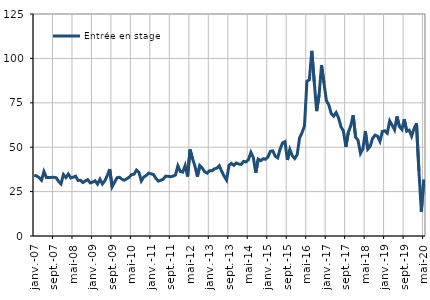
| Category | Entrée en stage |
|---|---|
| 2007-01-01 | 34.2 |
| 2007-02-01 | 33.8 |
| 2007-03-01 | 32.9 |
| 2007-04-01 | 31.4 |
| 2007-05-01 | 36.3 |
| 2007-06-01 | 33 |
| 2007-07-01 | 33 |
| 2007-08-01 | 33 |
| 2007-09-01 | 33.1 |
| 2007-10-01 | 32.8 |
| 2007-11-01 | 30.8 |
| 2007-12-01 | 29.3 |
| 2008-01-01 | 34.6 |
| 2008-02-01 | 32.9 |
| 2008-03-01 | 34.9 |
| 2008-04-01 | 32.7 |
| 2008-05-01 | 33.1 |
| 2008-06-01 | 33.7 |
| 2008-07-01 | 31.3 |
| 2008-08-01 | 31.4 |
| 2008-09-01 | 30.1 |
| 2008-10-01 | 31 |
| 2008-11-01 | 31.7 |
| 2008-12-01 | 29.9 |
| 2009-01-01 | 30.3 |
| 2009-02-01 | 31.1 |
| 2009-03-01 | 29.2 |
| 2009-04-01 | 32 |
| 2009-05-01 | 29.3 |
| 2009-06-01 | 31.1 |
| 2009-07-01 | 34 |
| 2009-08-01 | 37.7 |
| 2009-09-01 | 27.7 |
| 2009-10-01 | 30.3 |
| 2009-11-01 | 32.8 |
| 2009-12-01 | 33.1 |
| 2010-01-01 | 32 |
| 2010-02-01 | 31.4 |
| 2010-03-01 | 32.2 |
| 2010-04-01 | 33.1 |
| 2010-05-01 | 34.5 |
| 2010-06-01 | 34.8 |
| 2010-07-01 | 37.1 |
| 2010-08-01 | 35.9 |
| 2010-09-01 | 31 |
| 2010-10-01 | 33.2 |
| 2010-11-01 | 34.1 |
| 2010-12-01 | 35.4 |
| 2011-01-01 | 35 |
| 2011-02-01 | 34.6 |
| 2011-03-01 | 32.4 |
| 2011-04-01 | 30.9 |
| 2011-05-01 | 31.4 |
| 2011-06-01 | 32 |
| 2011-07-01 | 33.7 |
| 2011-08-01 | 33.6 |
| 2011-09-01 | 33.4 |
| 2011-10-01 | 33.7 |
| 2011-11-01 | 34.3 |
| 2011-12-01 | 39.5 |
| 2012-01-01 | 36.3 |
| 2012-02-01 | 36 |
| 2012-03-01 | 39.7 |
| 2012-04-01 | 33.5 |
| 2012-05-01 | 48.7 |
| 2012-06-01 | 43.6 |
| 2012-07-01 | 39.4 |
| 2012-08-01 | 33.4 |
| 2012-09-01 | 39.7 |
| 2012-10-01 | 38.3 |
| 2012-11-01 | 36.2 |
| 2012-12-01 | 35.4 |
| 2013-01-01 | 36.7 |
| 2013-02-01 | 36.7 |
| 2013-03-01 | 37.8 |
| 2013-04-01 | 38.2 |
| 2013-05-01 | 39.6 |
| 2013-06-01 | 36.4 |
| 2013-07-01 | 33.7 |
| 2013-08-01 | 31.5 |
| 2013-09-01 | 39.8 |
| 2013-10-01 | 40.9 |
| 2013-11-01 | 39.8 |
| 2013-12-01 | 41.1 |
| 2014-01-01 | 40.5 |
| 2014-02-01 | 40.3 |
| 2014-03-01 | 42 |
| 2014-04-01 | 41.7 |
| 2014-05-01 | 43.1 |
| 2014-06-01 | 47.1 |
| 2014-07-01 | 44.1 |
| 2014-08-01 | 35.7 |
| 2014-09-01 | 43.3 |
| 2014-10-01 | 42.4 |
| 2014-11-01 | 43.5 |
| 2014-12-01 | 43.2 |
| 2015-01-01 | 44.5 |
| 2015-02-01 | 47.7 |
| 2015-03-01 | 47.9 |
| 2015-04-01 | 44.9 |
| 2015-05-01 | 44 |
| 2015-06-01 | 49 |
| 2015-07-01 | 52.4 |
| 2015-08-01 | 53.1 |
| 2015-09-01 | 42.8 |
| 2015-10-01 | 48.7 |
| 2015-11-01 | 45.2 |
| 2015-12-01 | 43.6 |
| 2016-01-01 | 45.8 |
| 2016-02-01 | 55.3 |
| 2016-03-01 | 58.2 |
| 2016-04-01 | 61.9 |
| 2016-05-01 | 87.2 |
| 2016-06-01 | 87.9 |
| 2016-07-01 | 104.3 |
| 2016-08-01 | 86.9 |
| 2016-09-01 | 70.3 |
| 2016-10-01 | 79.5 |
| 2016-11-01 | 96.2 |
| 2016-12-01 | 86.2 |
| 2017-01-01 | 76.2 |
| 2017-02-01 | 73.8 |
| 2017-03-01 | 68.9 |
| 2017-04-01 | 67.5 |
| 2017-05-01 | 69.5 |
| 2017-06-01 | 66.5 |
| 2017-07-01 | 61.5 |
| 2017-08-01 | 59.1 |
| 2017-09-01 | 50.2 |
| 2017-10-01 | 58.3 |
| 2017-11-01 | 62.1 |
| 2017-12-01 | 68 |
| 2018-01-01 | 55.6 |
| 2018-02-01 | 53.9 |
| 2018-03-01 | 46.5 |
| 2018-04-01 | 49.1 |
| 2018-05-01 | 59 |
| 2018-06-01 | 48.9 |
| 2018-07-01 | 50.5 |
| 2018-08-01 | 55.1 |
| 2018-09-01 | 56.8 |
| 2018-10-01 | 56.2 |
| 2018-11-01 | 53.3 |
| 2018-12-01 | 58.9 |
| 2019-01-01 | 59.2 |
| 2019-02-01 | 57.9 |
| 2019-03-01 | 64.8 |
| 2019-04-01 | 62.4 |
| 2019-05-01 | 59.8 |
| 2019-06-01 | 67.3 |
| 2019-07-01 | 61.6 |
| 2019-08-01 | 60 |
| 2019-09-01 | 65.7 |
| 2019-10-01 | 59 |
| 2019-11-01 | 59.6 |
| 2019-12-01 | 56.2 |
| 2020-01-01 | 60.4 |
| 2020-02-01 | 63.4 |
| 2020-03-01 | 36.7 |
| 2020-04-01 | 13.7 |
| 2020-05-01 | 31.7 |